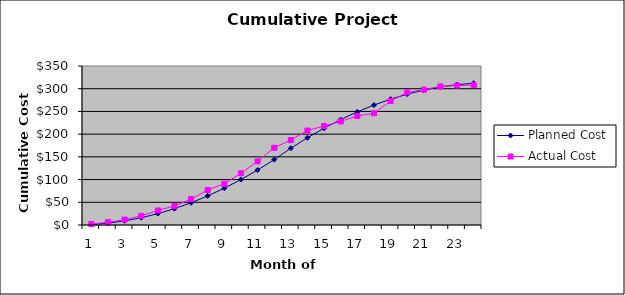
| Category | Planned Cost | Actual Cost |
|---|---|---|
| 0 | 1 | 2 |
| 1 | 4 | 6 |
| 2 | 9 | 12 |
| 3 | 16 | 20 |
| 4 | 25 | 32 |
| 5 | 36 | 42 |
| 6 | 49 | 57 |
| 7 | 64 | 77 |
| 8 | 81 | 91 |
| 9 | 100 | 114 |
| 10 | 121 | 140 |
| 11 | 144 | 170 |
| 12 | 169 | 187 |
| 13 | 192 | 208 |
| 14 | 213 | 218 |
| 15 | 232 | 228 |
| 16 | 249 | 240 |
| 17 | 264 | 246 |
| 18 | 277 | 273 |
| 19 | 288 | 292 |
| 20 | 297 | 298 |
| 21 | 304 | 305 |
| 22 | 309 | 307 |
| 23 | 312 | 308 |